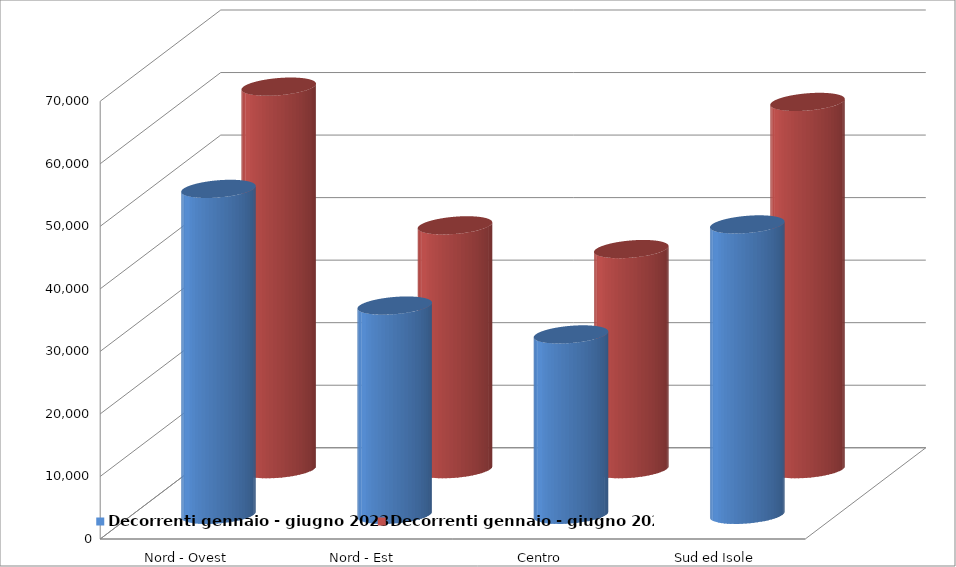
| Category | Decorrenti gennaio - giugno 2023 | Decorrenti gennaio - giugno 2022 |
|---|---|---|
| Nord - Ovest | 52118 | 61173 |
| Nord - Est | 33459 | 38994 |
| Centro | 28845 | 35200 |
| Sud ed Isole | 46434 | 58729 |